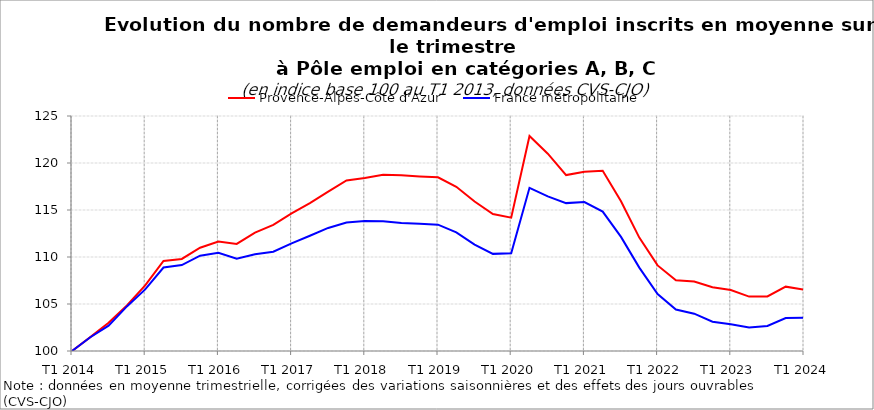
| Category | Provence-Alpes-Côte d'Azur | France métropolitaine |
|---|---|---|
| T1 2014 | 100 | 100 |
| T2 2014 | 101.478 | 101.464 |
| T3 2014 | 103.011 | 102.693 |
| T4 2014 | 104.849 | 104.744 |
| T1 2015 | 106.973 | 106.558 |
| T2 2015 | 109.581 | 108.879 |
| T3 2015 | 109.792 | 109.143 |
| T4 2015 | 110.986 | 110.142 |
| T1 2016 | 111.654 | 110.454 |
| T2 2016 | 111.391 | 109.806 |
| T3 2016 | 112.597 | 110.299 |
| T4 2016 | 113.424 | 110.559 |
| T1 2017 | 114.639 | 111.452 |
| T2 2017 | 115.733 | 112.266 |
| T3 2017 | 116.953 | 113.091 |
| T4 2017 | 118.142 | 113.677 |
| T1 2018 | 118.414 | 113.83 |
| T2 2018 | 118.748 | 113.798 |
| T3 2018 | 118.701 | 113.612 |
| T4 2018 | 118.571 | 113.531 |
| T1 2019 | 118.481 | 113.443 |
| T2 2019 | 117.467 | 112.617 |
| T3 2019 | 115.904 | 111.322 |
| T4 2019 | 114.572 | 110.333 |
| T1 2020 | 114.189 | 110.402 |
| T2 2020 | 122.872 | 117.362 |
| T3 2020 | 120.994 | 116.443 |
| T4 2020 | 118.715 | 115.732 |
| T1 2021 | 119.059 | 115.842 |
| T2 2021 | 119.182 | 114.831 |
| T3 2021 | 115.92 | 112.138 |
| T4 2021 | 112.064 | 108.873 |
| T1 2022 | 109.105 | 106.055 |
| T2 2022 | 107.521 | 104.407 |
| T3 2022 | 107.397 | 103.968 |
| T4 2022 | 106.791 | 103.117 |
| T1 2023 | 106.49 | 102.837 |
| T2 2023 | 105.789 | 102.495 |
| T3 2023 | 105.806 | 102.66 |
| T4 2023 | 106.846 | 103.499 |
| T1 2024 | 106.519 | 103.551 |